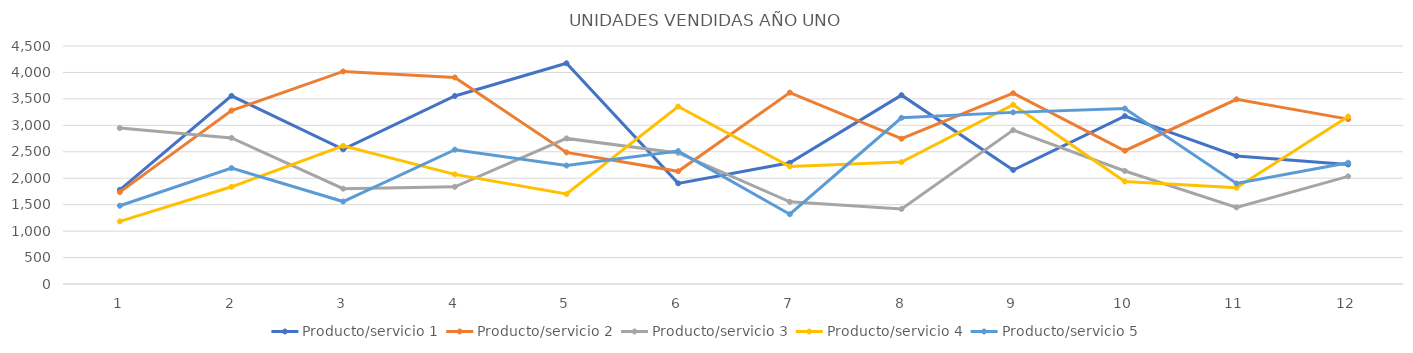
| Category | Producto/servicio 1 | Producto/servicio 2 | Producto/servicio 3 | Producto/servicio 4 | Producto/servicio 5 |
|---|---|---|---|---|---|
| 0 | 1779 | 1737 | 2949 | 1184 | 1480 |
| 1 | 3557 | 3279 | 2762 | 1838 | 2192 |
| 2 | 2546 | 4019 | 1802 | 2613 | 1559 |
| 3 | 3555 | 3905 | 1838 | 2073 | 2539 |
| 4 | 4174 | 2488 | 2753 | 1702 | 2239 |
| 5 | 1903 | 2131 | 2478 | 3356 | 2513 |
| 6 | 2291 | 3619 | 1553 | 2222 | 1320 |
| 7 | 3571 | 2747 | 1419 | 2305 | 3142 |
| 8 | 2155 | 3607 | 2909 | 3390 | 3245 |
| 9 | 3174 | 2520 | 2137 | 1939 | 3318 |
| 10 | 2420 | 3492 | 1448 | 1819 | 1900 |
| 11 | 2260 | 3117 | 2035 | 3166 | 2292 |